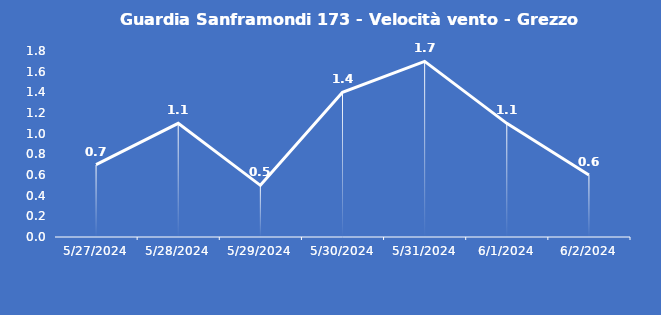
| Category | Guardia Sanframondi 173 - Velocità vento - Grezzo (m/s) |
|---|---|
| 5/27/24 | 0.7 |
| 5/28/24 | 1.1 |
| 5/29/24 | 0.5 |
| 5/30/24 | 1.4 |
| 5/31/24 | 1.7 |
| 6/1/24 | 1.1 |
| 6/2/24 | 0.6 |